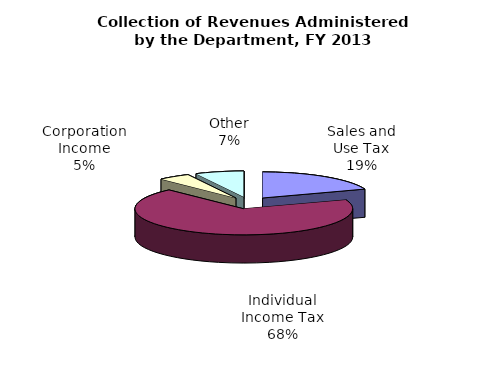
| Category | Series 0 |
|---|---|
| Sales and Use Tax | 3219798000 |
| Individual Income Tax | 11339965000 |
| Corporation Income | 796728000 |
| Other | 1201691000 |